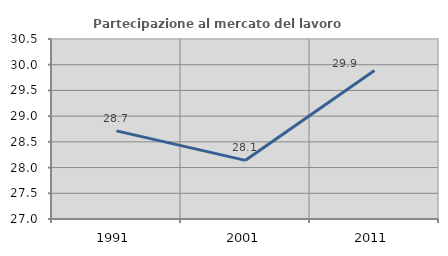
| Category | Partecipazione al mercato del lavoro  femminile |
|---|---|
| 1991.0 | 28.714 |
| 2001.0 | 28.141 |
| 2011.0 | 29.887 |